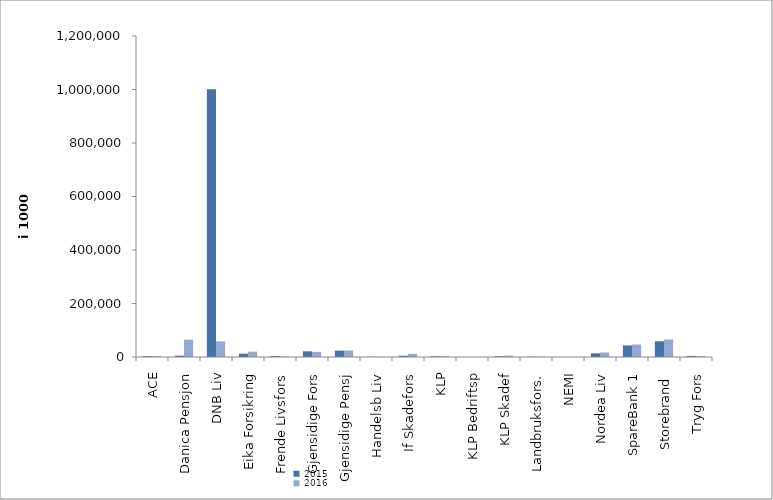
| Category | 2015 | 2016 |
|---|---|---|
| ACE | 3472.69 | 3472.69 |
| Danica Pensjon | 5051 | 64793.247 |
| DNB Liv | 1001335.135 | 58422.541 |
| Eika Forsikring | 12237 | 20045 |
| Frende Livsfors | 3641 | 1972 |
| Gjensidige Fors | 21358 | 19004 |
| Gjensidige Pensj | 23793.186 | 24211.812 |
| Handelsb Liv | 903 | 703 |
| If Skadefors | 4778 | 11849 |
| KLP | 2962 | 3064 |
| KLP Bedriftsp | 0 | 0 |
| KLP Skadef | 2992.837 | 5032 |
| Landbruksfors. | 1247 | 1307 |
| NEMI | 0 | 0 |
| Nordea Liv | 13641 | 16662.195 |
| SpareBank 1 | 43293.02 | 46808.262 |
| Storebrand  | 58776.373 | 65455.891 |
| Tryg Fors | 3963 | 3738.2 |